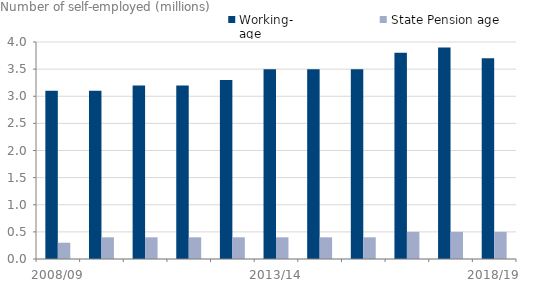
| Category | Working-
age | State Pension age |
|---|---|---|
| 2008/09 | 3.1 | 0.3 |
| 2009/10 | 3.1 | 0.4 |
| 2010/11 | 3.2 | 0.4 |
| 2011/12 | 3.2 | 0.4 |
| 2012/13 | 3.3 | 0.4 |
| 2013/14 | 3.5 | 0.4 |
| 2014/15 | 3.5 | 0.4 |
| 2015/16 | 3.5 | 0.4 |
| 2016/17 | 3.8 | 0.5 |
| 2017/18 | 3.9 | 0.5 |
| 2018/19 | 3.7 | 0.5 |